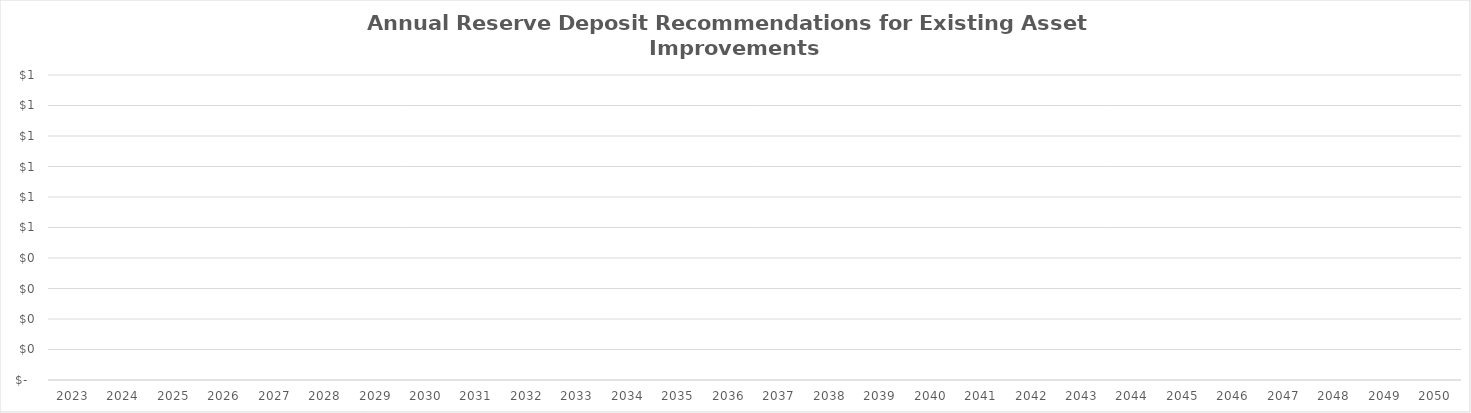
| Category | Series 0 |
|---|---|
| 2023.0 | 0 |
| 2024.0 | 0 |
| 2025.0 | 0 |
| 2026.0 | 0 |
| 2027.0 | 0 |
| 2028.0 | 0 |
| 2029.0 | 0 |
| 2030.0 | 0 |
| 2031.0 | 0 |
| 2032.0 | 0 |
| 2033.0 | 0 |
| 2034.0 | 0 |
| 2035.0 | 0 |
| 2036.0 | 0 |
| 2037.0 | 0 |
| 2038.0 | 0 |
| 2039.0 | 0 |
| 2040.0 | 0 |
| 2041.0 | 0 |
| 2042.0 | 0 |
| 2043.0 | 0 |
| 2044.0 | 0 |
| 2045.0 | 0 |
| 2046.0 | 0 |
| 2047.0 | 0 |
| 2048.0 | 0 |
| 2049.0 | 0 |
| 2050.0 | 0 |